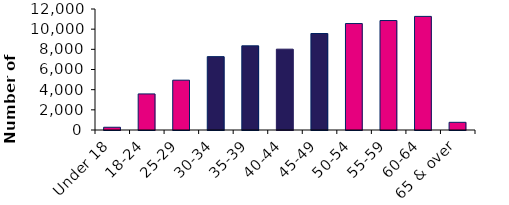
| Category | Series 1 |
|---|---|
| Under 18 | 272 |
| 18-24 | 3577 |
| 25-29 | 4941 |
| 30-34 | 7276 |
| 35-39 | 8347 |
| 40-44 | 8017 |
| 45-49 | 9570 |
| 50-54 | 10556 |
| 55-59 | 10856 |
| 60-64 | 11267 |
| 65 & over | 762 |